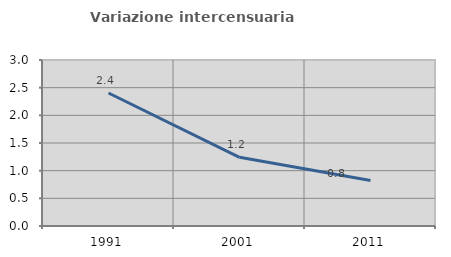
| Category | Variazione intercensuaria annua |
|---|---|
| 1991.0 | 2.404 |
| 2001.0 | 1.241 |
| 2011.0 | 0.823 |